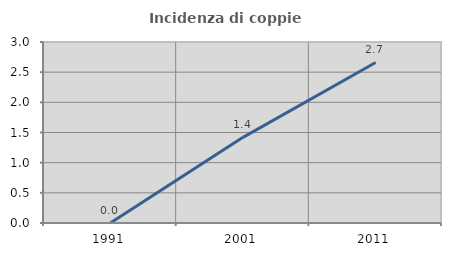
| Category | Incidenza di coppie miste |
|---|---|
| 1991.0 | 0 |
| 2001.0 | 1.42 |
| 2011.0 | 2.661 |